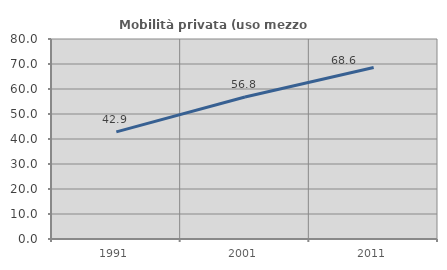
| Category | Mobilità privata (uso mezzo privato) |
|---|---|
| 1991.0 | 42.851 |
| 2001.0 | 56.826 |
| 2011.0 | 68.635 |